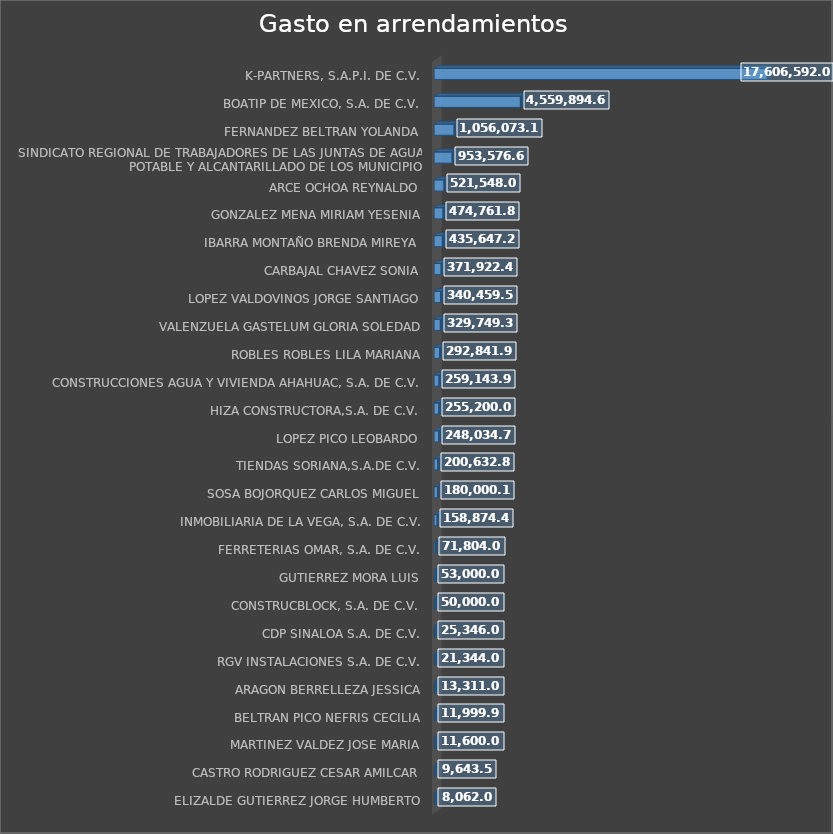
| Category | Suma |
|---|---|
| ELIZALDE GUTIERREZ JORGE HUMBERTO | 8062 |
| CASTRO RODRIGUEZ CESAR AMILCAR | 9643.5 |
| MARTINEZ VALDEZ JOSE MARIA | 11600 |
| BELTRAN PICO NEFRIS CECILIA | 11999.99 |
| ARAGON BERRELLEZA JESSICA | 13311 |
| RGV INSTALACIONES S.A. DE C.V. | 21344 |
| CDP SINALOA S.A. DE C.V. | 25346 |
| CONSTRUCBLOCK, S.A. DE C.V. | 50000 |
| GUTIERREZ MORA LUIS | 53000 |
| FERRETERIAS OMAR, S.A. DE C.V. | 71804 |
| INMOBILIARIA DE LA VEGA, S.A. DE C.V. | 158874.48 |
| SOSA BOJORQUEZ CARLOS MIGUEL | 180000.12 |
| TIENDAS SORIANA,S.A.DE C.V. | 200632.86 |
| LOPEZ PICO LEOBARDO | 248034.75 |
| HIZA CONSTRUCTORA,S.A. DE C.V. | 255200 |
| CONSTRUCCIONES AGUA Y VIVIENDA AHAHUAC, S.A. DE C.V. | 259143.9 |
| ROBLES ROBLES LILA MARIANA | 292841.99 |
| VALENZUELA GASTELUM GLORIA SOLEDAD | 329749.33 |
| LOPEZ VALDOVINOS JORGE SANTIAGO | 340459.52 |
| CARBAJAL CHAVEZ SONIA | 371922.47 |
| IBARRA MONTAÑO BRENDA MIREYA | 435647.28 |
| GONZALEZ MENA MIRIAM YESENIA | 474761.82 |
| ARCE OCHOA REYNALDO | 521548.01 |
| SINDICATO REGIONAL DE TRABAJADORES DE LAS JUNTAS DE AGUA POTABLE Y ALCANTARILLADO DE LOS MUNICIPIO | 953576.69 |
| FERNANDEZ BELTRAN YOLANDA | 1056073.17 |
| BOATIP DE MEXICO, S.A. DE C.V. | 4559894.67 |
| K-PARTNERS, S.A.P.I. DE C.V. | 17606592 |